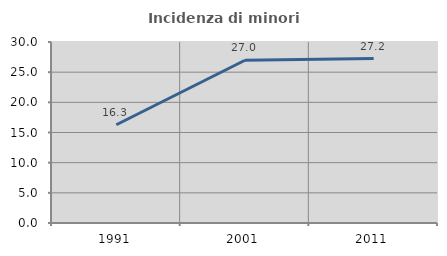
| Category | Incidenza di minori stranieri |
|---|---|
| 1991.0 | 16.279 |
| 2001.0 | 26.971 |
| 2011.0 | 27.247 |